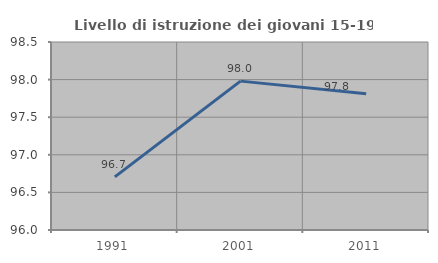
| Category | Livello di istruzione dei giovani 15-19 anni |
|---|---|
| 1991.0 | 96.707 |
| 2001.0 | 97.98 |
| 2011.0 | 97.812 |